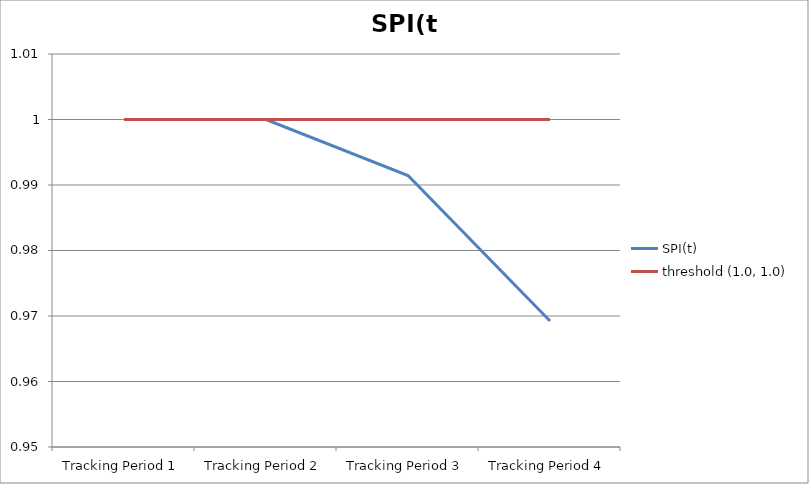
| Category | SPI(t) | threshold (1.0, 1.0) |
|---|---|---|
| Tracking Period 1 | 1 | 1 |
| Tracking Period 2 | 1 | 1 |
| Tracking Period 3 | 0.991 | 1 |
| Tracking Period 4 | 0.969 | 1 |